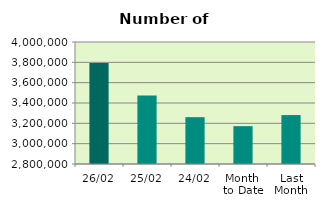
| Category | Series 0 |
|---|---|
| 26/02 | 3792400 |
| 25/02 | 3473222 |
| 24/02 | 3260384 |
| Month 
to Date | 3172414.4 |
| Last
Month | 3281385.4 |